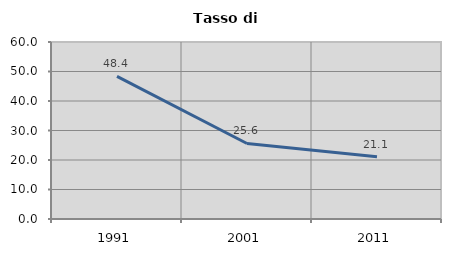
| Category | Tasso di disoccupazione   |
|---|---|
| 1991.0 | 48.352 |
| 2001.0 | 25.595 |
| 2011.0 | 21.131 |